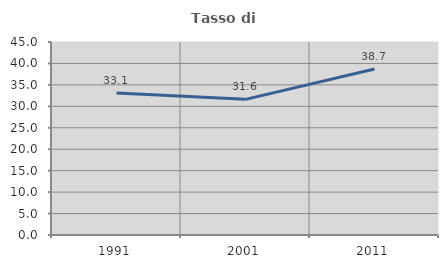
| Category | Tasso di occupazione   |
|---|---|
| 1991.0 | 33.137 |
| 2001.0 | 31.624 |
| 2011.0 | 38.702 |